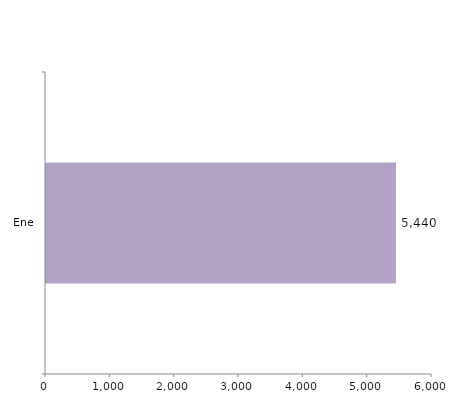
| Category | Series 0 |
|---|---|
| Ene | 5440 |